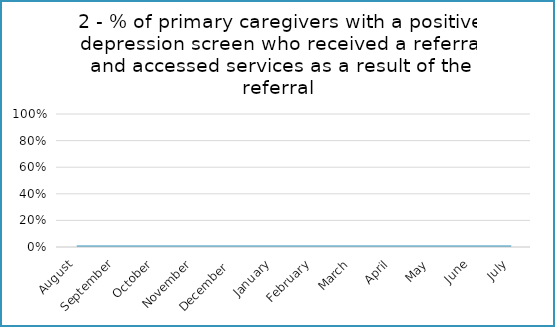
| Category | 2 - % of primary caregivers with a positive depression screen who received a referral and accessed services as a result of the referral |
|---|---|
| August | 0 |
| September | 0 |
| October | 0 |
| November | 0 |
| December  | 0 |
| January | 0 |
| February | 0 |
| March | 0 |
| April | 0 |
| May | 0 |
| June | 0 |
| July | 0 |